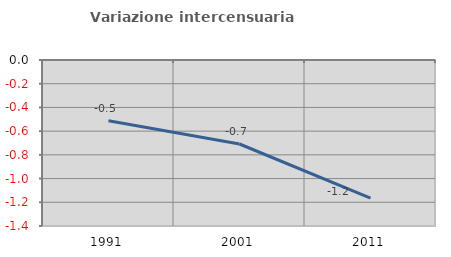
| Category | Variazione intercensuaria annua |
|---|---|
| 1991.0 | -0.512 |
| 2001.0 | -0.708 |
| 2011.0 | -1.164 |